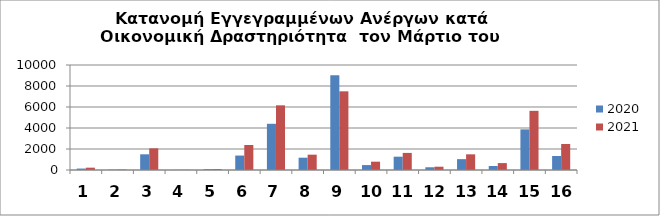
| Category | 2020 | 2021 |
|---|---|---|
| 0 | 138 | 222 |
| 1 | 34 | 45 |
| 2 | 1495 | 2063 |
| 3 | 12 | 15 |
| 4 | 87 | 96 |
| 5 | 1376 | 2381 |
| 6 | 4400 | 6159 |
| 7 | 1172 | 1461 |
| 8 | 9028 | 7493 |
| 9 | 468 | 793 |
| 10 | 1268 | 1628 |
| 11 | 261 | 313 |
| 12 | 1034 | 1493 |
| 13 | 379 | 659 |
| 14 | 3869 | 5635 |
| 15 | 1332 | 2477 |